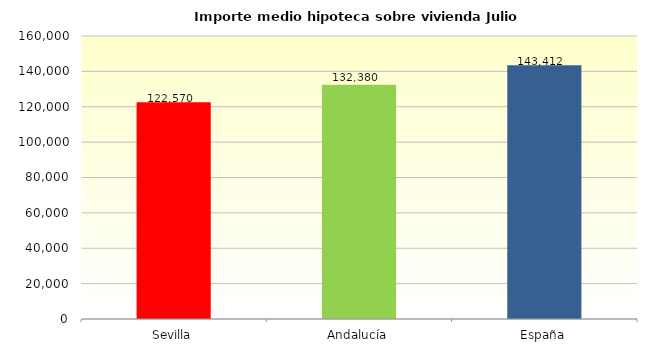
| Category | Series 2 |
|---|---|
| Sevilla | 122570.045 |
| Andalucía | 132379.636 |
| España | 143412.21 |